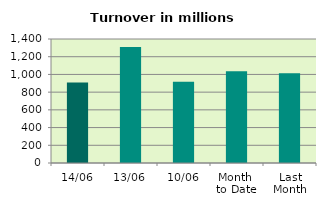
| Category | Series 0 |
|---|---|
| 14/06 | 909.794 |
| 13/06 | 1309.288 |
| 10/06 | 916.373 |
| Month 
to Date | 1035.246 |
| Last
Month | 1012.592 |